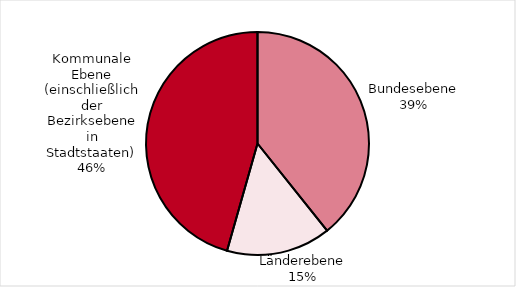
| Category | Series 0 |
|---|---|
| Bundesebene | 39.272 |
| Länderebene | 15.134 |
| Kommunale Ebene (einschließlich der Bezirksebene in Stadtstaaten) | 45.594 |